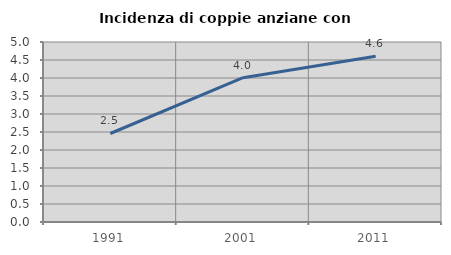
| Category | Incidenza di coppie anziane con figli |
|---|---|
| 1991.0 | 2.458 |
| 2001.0 | 4.008 |
| 2011.0 | 4.601 |